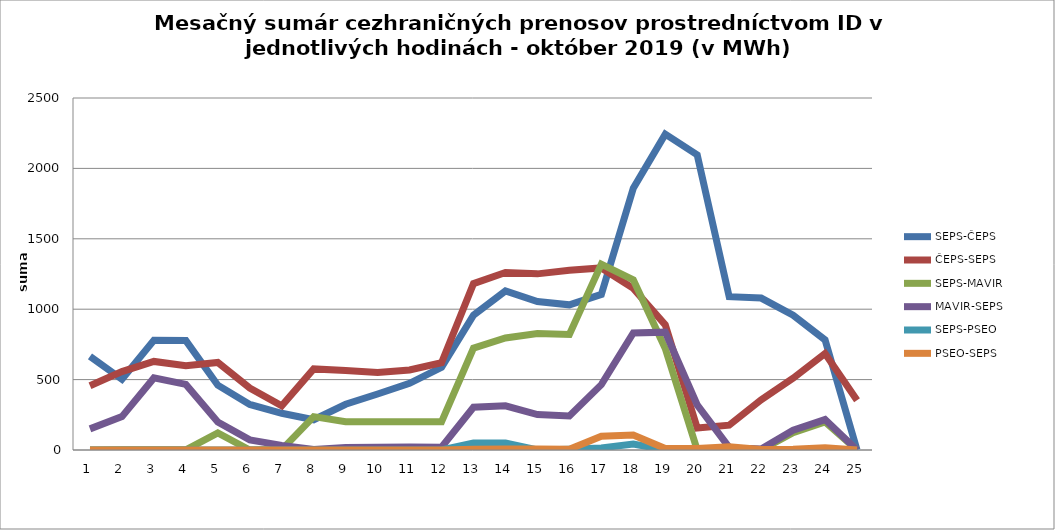
| Category | SEPS-ČEPS | ČEPS-SEPS | SEPS-MAVIR | MAVIR-SEPS | SEPS-PSEO | PSEO-SEPS |
|---|---|---|---|---|---|---|
| 1.0 | 665 | 456 | 0 | 150 | 0 | 0 |
| 2.0 | 502 | 557 | 1 | 237 | 0 | 0 |
| 3.0 | 780 | 629 | 2 | 512 | 0 | 0 |
| 4.0 | 777 | 598 | 1 | 466 | 0 | 0 |
| 5.0 | 460 | 622 | 121 | 198 | 0 | 0 |
| 6.0 | 324 | 440 | 0 | 72 | 0 | 0 |
| 7.0 | 261 | 314 | 3 | 33 | 0 | 0 |
| 8.0 | 215 | 576 | 237 | 3 | 0 | 0 |
| 9.0 | 325 | 564 | 201 | 18 | 0 | 0 |
| 10.0 | 398 | 550 | 200 | 20 | 0 | 0 |
| 11.0 | 474 | 568 | 200 | 21 | 0 | 0 |
| 12.0 | 587 | 620 | 200 | 20 | 0 | 0 |
| 13.0 | 958 | 1182 | 723 | 304 | 50 | 5 |
| 14.0 | 1130 | 1261 | 796 | 314 | 50 | 7 |
| 15.0 | 1054 | 1251 | 827 | 252 | 0 | 7 |
| 16.0 | 1031 | 1276 | 821 | 242 | 5 | 5 |
| 17.0 | 1105 | 1293 | 1320 | 464 | 15 | 98 |
| 18.0 | 1859 | 1148 | 1209 | 831 | 43 | 107 |
| 19.0 | 2243 | 889 | 721 | 837 | 0 | 10 |
| 20.0 | 2096 | 156 | 0 | 320 | 6 | 10 |
| 21.0 | 1089 | 176 | 0 | 18 | 0 | 23 |
| 22.0 | 1079 | 357 | 0 | 7 | 0 | 3 |
| 23.0 | 958 | 510 | 123 | 140 | 0 | 5 |
| 24.0 | 782 | 685 | 200 | 216 | 0 | 16 |
| 25.0 | 0 | 354 | 0 | 0 | 0 | 0 |